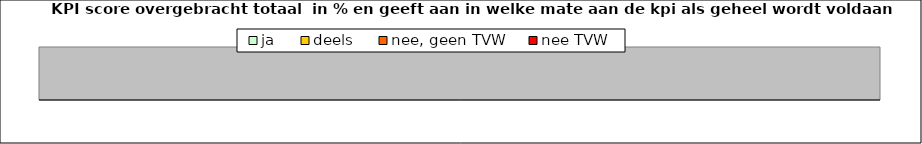
| Category | ja | deels | nee, geen TVW | nee TVW |
|---|---|---|---|---|
| 0 | 0 | 0 | 0 | 0 |